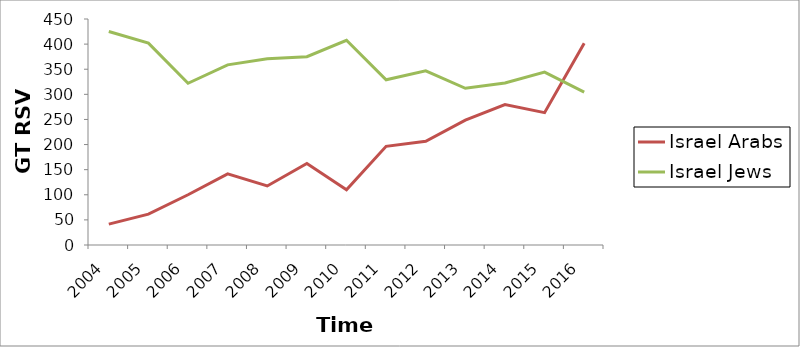
| Category | Israel Arabs | Israel Jews |
|---|---|---|
| 2004.0 | 41.5 | 425 |
| 2005.0 | 61.5 | 402 |
| 2006.0 | 100 | 322 |
| 2007.0 | 141.5 | 358.667 |
| 2008.0 | 117.5 | 370.667 |
| 2009.0 | 162.5 | 375 |
| 2010.0 | 110 | 407.667 |
| 2011.0 | 196.5 | 329 |
| 2012.0 | 206.5 | 346.667 |
| 2013.0 | 248.5 | 312 |
| 2014.0 | 279.5 | 322.667 |
| 2015.0 | 263.5 | 344.333 |
| 2016.0 | 401.5 | 304.333 |